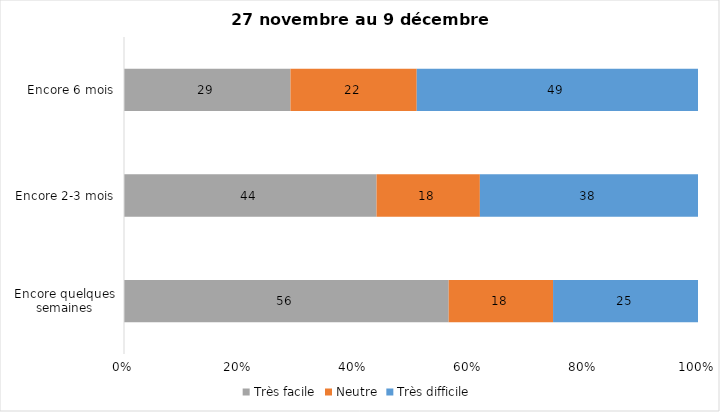
| Category | Très facile | Neutre | Très difficile |
|---|---|---|---|
| Encore quelques semaines | 56 | 18 | 25 |
| Encore 2-3 mois | 44 | 18 | 38 |
| Encore 6 mois | 29 | 22 | 49 |